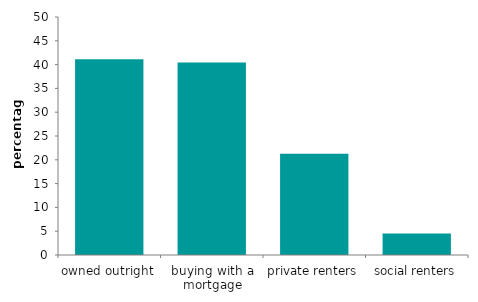
| Category | Series 0 |
|---|---|
| owned outright | 41.14 |
| buying with a mortgage | 40.457 |
| private renters | 21.274 |
| social renters | 4.517 |